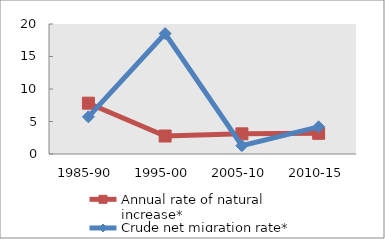
| Category | Annual rate of natural increase* | Crude net migration rate* |
|---|---|---|
| 1985-90 | 7.818 | 5.716 |
| 1995-00 | 2.767 | 18.521 |
| 2005-10 | 3.1 | 1.283 |
| 2010-15 | 3.176 | 4.177 |